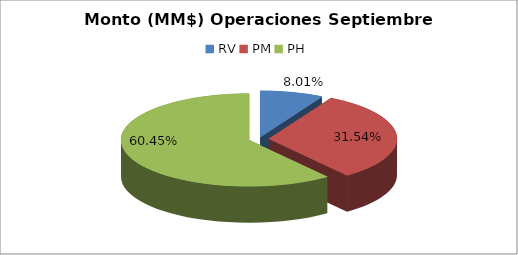
| Category | Series 0 |
|---|---|
| RV | 1122686.945 |
| PM | 4418671.366 |
| PH | 8468015.825 |